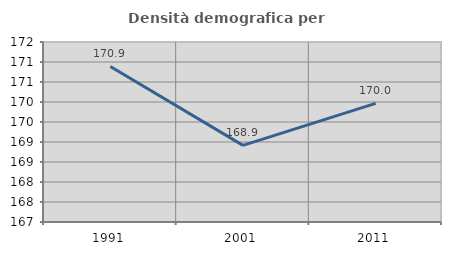
| Category | Densità demografica |
|---|---|
| 1991.0 | 170.888 |
| 2001.0 | 168.916 |
| 2011.0 | 169.966 |